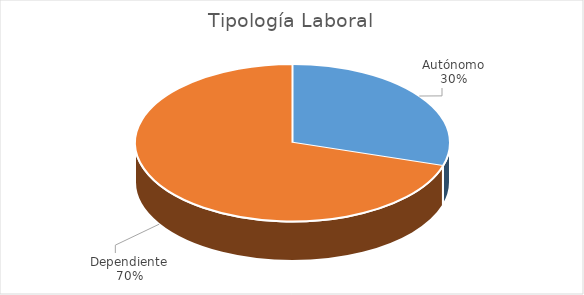
| Category | Total |
|---|---|
| Autónomo | 14 |
| Dependiente | 33 |